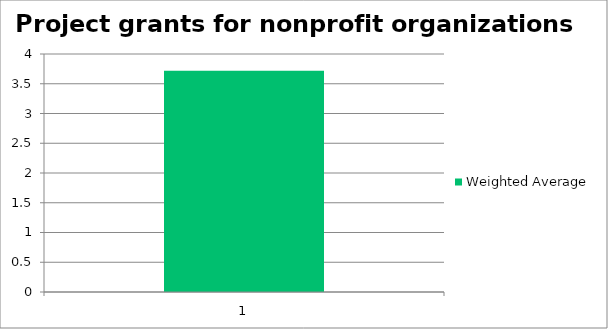
| Category | Weighted Average |
|---|---|
| 1.0 | 3.72 |